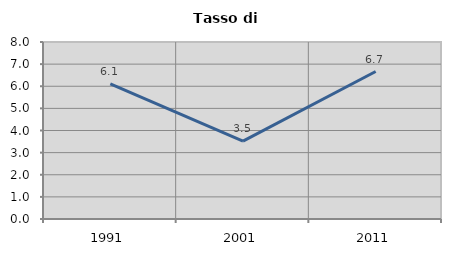
| Category | Tasso di disoccupazione   |
|---|---|
| 1991.0 | 6.111 |
| 2001.0 | 3.518 |
| 2011.0 | 6.667 |